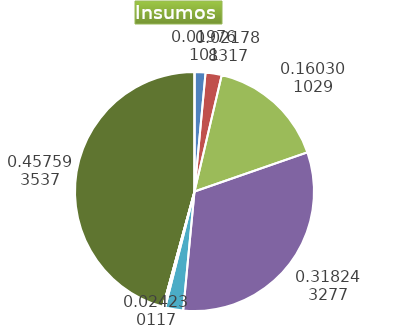
| Category | Series 0 |
|---|---|
| Control arvenses | 1295192 |
| Control fitosanitario | 1911797 |
| Cosecha y beneficio | 14065474.766 |
| Fertilización | 27923980.277 |
| Instalación | 2126050.609 |
| Otros | 270490 |
| Podas | 0 |
| Riego | 0 |
| Transporte | 40151148 |
| Tutorado | 0 |